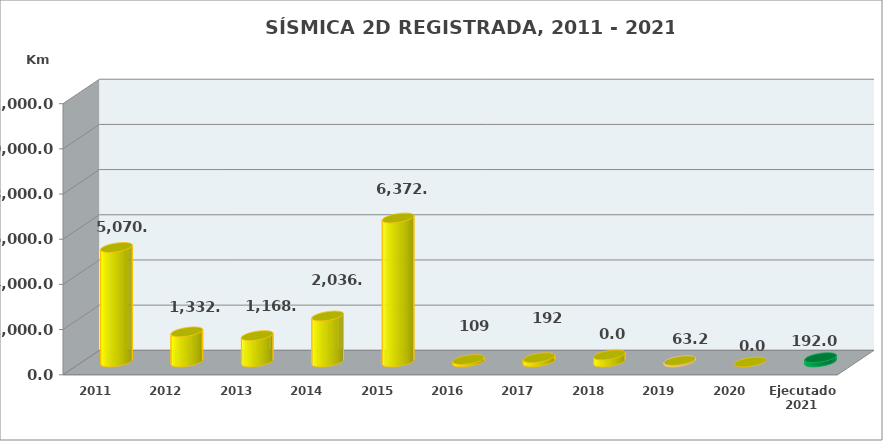
| Category | Series 0 |
|---|---|
| 2011 | 5070.18 |
| 2012 | 1332.85 |
| 2013 | 1168 |
| 2014 | 2036 |
| 2015 | 6372.61 |
| 2016 | 109 |
| 2017 | 191.95 |
| 2018 | 313.4 |
| 2019 | 63.22 |
| 2020 | 0 |
| Ejecutado 2021 | 191.95 |